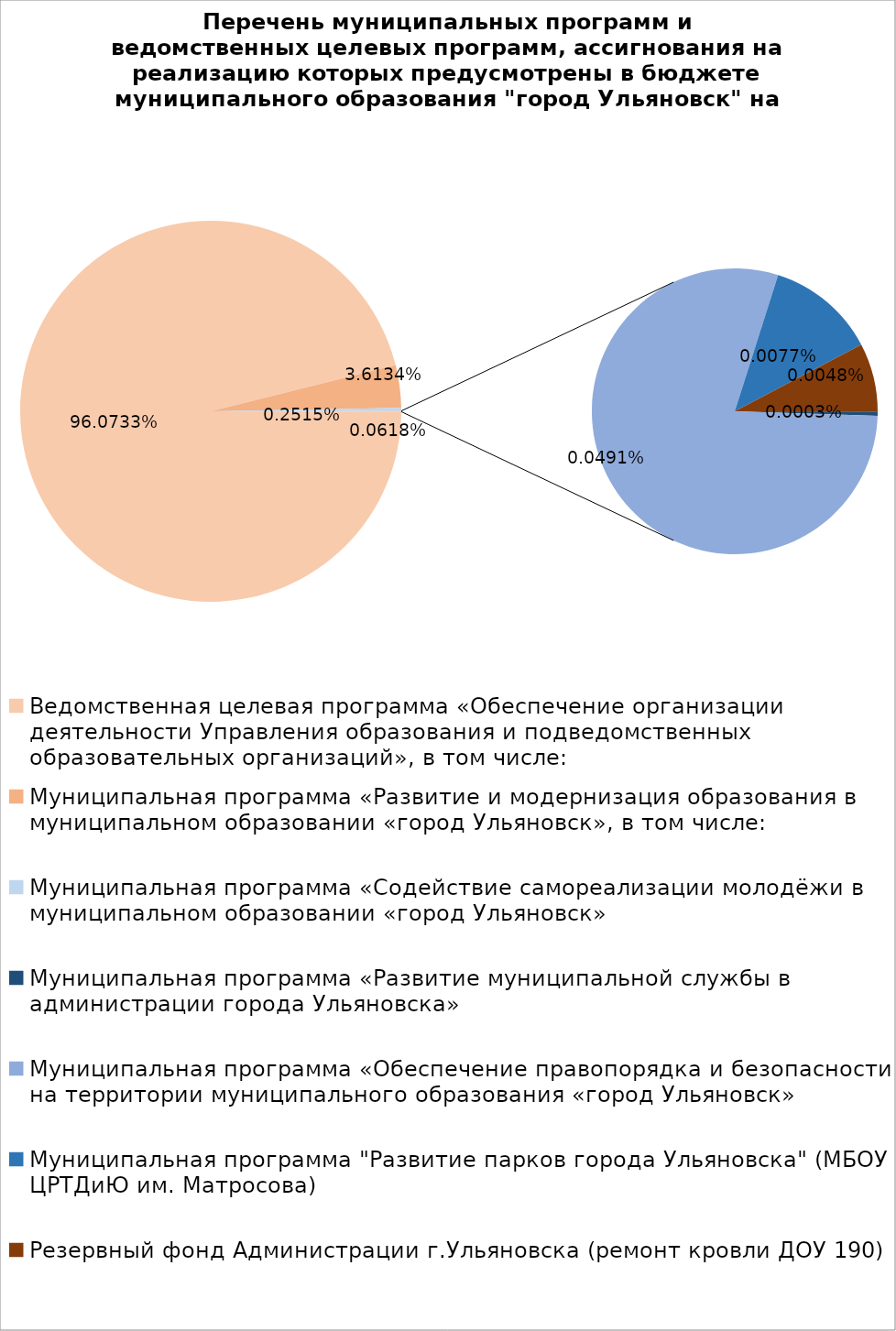
| Category | Series 0 |
|---|---|
| Ведомственная целевая программа «Обеспечение организации деятельности Управления образования и подведомственных образовательных организаций», в том числе: | 5022400.36 |
| Муниципальная программа «Развитие и модернизация образования в муниципальном образовании «город Ульяновск», в том числе: | 188896.7 |
| Муниципальная программа «Содействие самореализации молодёжи в муниципальном образовании «город Ульяновск» | 13148.32 |
| Муниципальная программа «Развитие муниципальной службы в администрации города Ульяновска» | 15.4 |
| Муниципальная программа «Обеспечение правопорядка и безопасности на территории муниципального образования «город Ульяновск» | 2565 |
| Муниципальная программа "Развитие парков города Ульяновска" (МБОУ ЦРТДиЮ им. Матросова) | 400 |
| Резервный фонд Администрации г.Ульяновска (ремонт кровли ДОУ 190) | 250 |